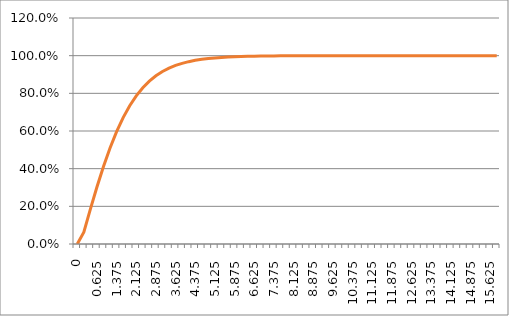
| Category | Series 1 |
|---|---|
| 0.0 | 0 |
| 0.125 | 0.062 |
| 0.375 | 0.185 |
| 0.625 | 0.303 |
| 0.875 | 0.412 |
| 1.125 | 0.51 |
| 1.375 | 0.596 |
| 1.625 | 0.671 |
| 1.875 | 0.734 |
| 2.125 | 0.787 |
| 2.375 | 0.83 |
| 2.625 | 0.865 |
| 2.875 | 0.893 |
| 3.125 | 0.916 |
| 3.375 | 0.934 |
| 3.625 | 0.948 |
| 3.875 | 0.959 |
| 4.125 | 0.968 |
| 4.375 | 0.975 |
| 4.625 | 0.981 |
| 4.875 | 0.985 |
| 5.125 | 0.988 |
| 5.375 | 0.991 |
| 5.625 | 0.993 |
| 5.875 | 0.994 |
| 6.125 | 0.996 |
| 6.375 | 0.997 |
| 6.625 | 0.997 |
| 6.875 | 0.998 |
| 7.125 | 0.998 |
| 7.375 | 0.999 |
| 7.625 | 0.999 |
| 7.875 | 0.999 |
| 8.125 | 0.999 |
| 8.375 | 1 |
| 8.625 | 1 |
| 8.875 | 1 |
| 9.125 | 1 |
| 9.375 | 1 |
| 9.625 | 1 |
| 9.875 | 1 |
| 10.125 | 1 |
| 10.375 | 1 |
| 10.625 | 1 |
| 10.875 | 1 |
| 11.125 | 1 |
| 11.375 | 1 |
| 11.625 | 1 |
| 11.875 | 1 |
| 12.125 | 1 |
| 12.375 | 1 |
| 12.625 | 1 |
| 12.875 | 1 |
| 13.125 | 1 |
| 13.375 | 1 |
| 13.625 | 1 |
| 13.875 | 1 |
| 14.125 | 1 |
| 14.375 | 1 |
| 14.625 | 1 |
| 14.875 | 1 |
| 15.125 | 1 |
| 15.375 | 1 |
| 15.625 | 1 |
| 15.875 | 1 |